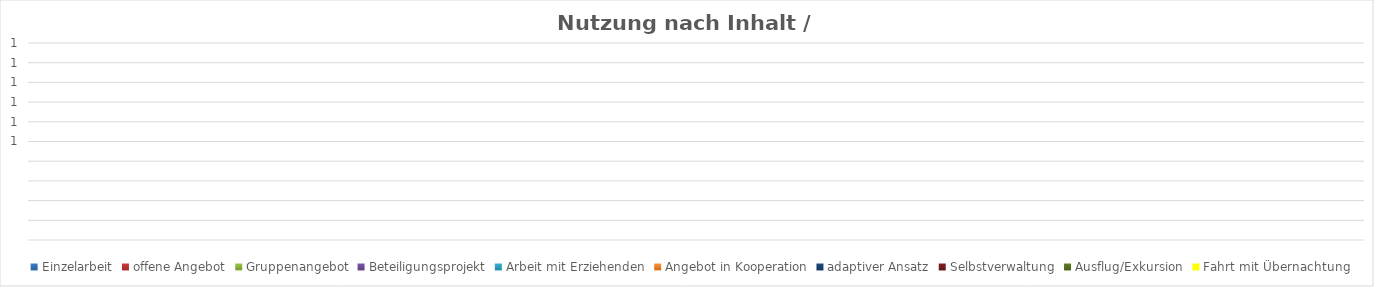
| Category | Einzelarbeit | offene Angebot | Gruppenangebot | Beteiligungsprojekt | Arbeit mit Erziehenden | Angebot in Kooperation | adaptiver Ansatz | Selbstverwaltung | Ausflug/Exkursion | Fahrt mit Übernachtung |
|---|---|---|---|---|---|---|---|---|---|---|
| 0 | 0 | 0 | 0 | 0 | 0 | 0 | 0 | 0 | 0 | 0 |